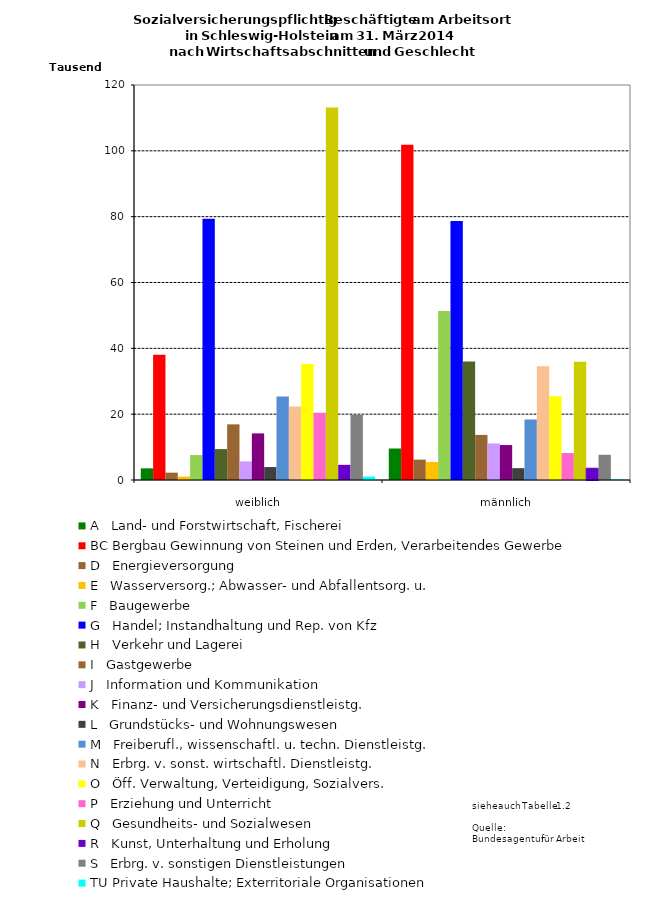
| Category | A   Land- und Forstwirtschaft, Fischerei | BC Bergbau Gewinnung von Steinen und Erden, Verarbeitendes Gewerbe | D   Energieversorgung | E   Wasserversorg.; Abwasser- und Abfallentsorg. u. | F   Baugewerbe | G   Handel; Instandhaltung und Rep. von Kfz | H   Verkehr und Lagerei | I   Gastgewerbe | J   Information und Kommunikation | K   Finanz- und Versicherungsdienstleistg. | L   Grundstücks- und Wohnungswesen | M   Freiberufl., wissenschaftl. u. techn. Dienstleistg. | N   Erbrg. v. sonst. wirtschaftl. Dienstleistg. | O   Öff. Verwaltung, Verteidigung, Sozialvers. | P   Erziehung und Unterricht | Q   Gesundheits- und Sozialwesen | R   Kunst, Unterhaltung und Erholung | S   Erbrg. v. sonstigen Dienstleistungen | TU Private Haushalte; Exterritoriale Organisationen |
|---|---|---|---|---|---|---|---|---|---|---|---|---|---|---|---|---|---|---|---|
| weiblich | 3535 | 38070 | 2228 | 1038 | 7574 | 79352 | 9388 | 16905 | 5649 | 14162 | 3933 | 25403 | 22363 | 35204 | 20450 | 113132 | 4605 | 19814 | 1049 |
| männlich | 9565 | 101827 | 6191 | 5474 | 51354 | 78682 | 35976 | 13697 | 11099 | 10618 | 3597 | 18387 | 34552 | 25439 | 8190 | 35929 | 3576 | 7667 | 217 |